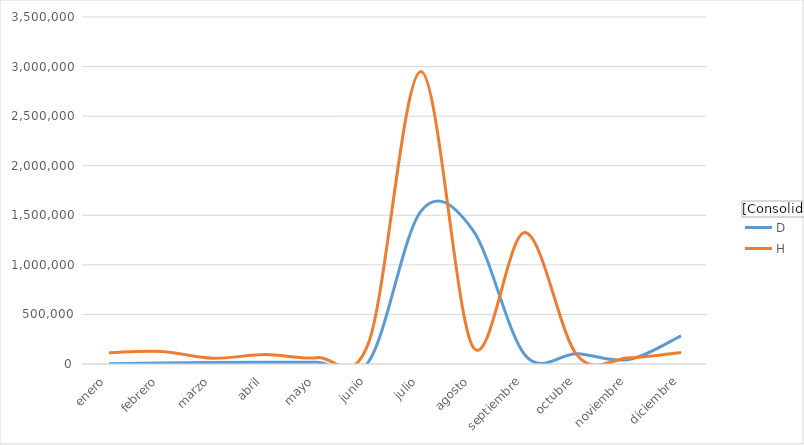
| Category | D | H |
|---|---|---|
| enero | 2622.11 | 113590.39 |
| febrero | 9310.21 | 126279.32 |
| marzo | 14513.32 | 58063.96 |
| abril | 17073.17 | 96310.29 |
| mayo | 18265.6 | 64163.17 |
| junio | 28033.09 | 224929.82 |
| julio | 1542317.66 | 2949697.91 |
| agosto | 1348814.04 | 172024.91 |
| septiembre | 91291.8 | 1325406.15 |
| octubre | 104084.67 | 89128.79 |
| noviembre | 44375.42 | 63650.93 |
| diciembre | 283975.74 | 116473.44 |